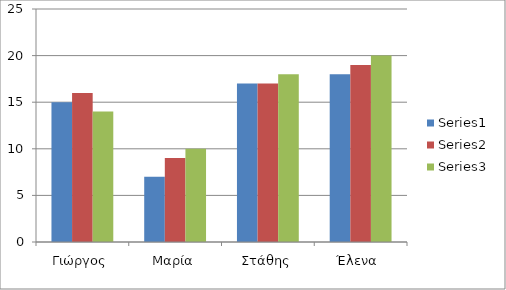
| Category | Series 0 | Series 1 | Series 2 |
|---|---|---|---|
| Γιώργος | 15 | 16 | 14 |
| Μαρία | 7 | 9 | 10 |
| Στάθης | 17 | 17 | 18 |
| Έλενα  | 18 | 19 | 20 |